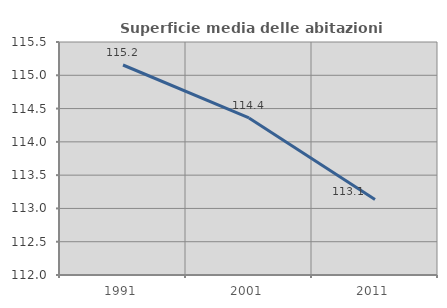
| Category | Superficie media delle abitazioni occupate |
|---|---|
| 1991.0 | 115.155 |
| 2001.0 | 114.359 |
| 2011.0 | 113.133 |